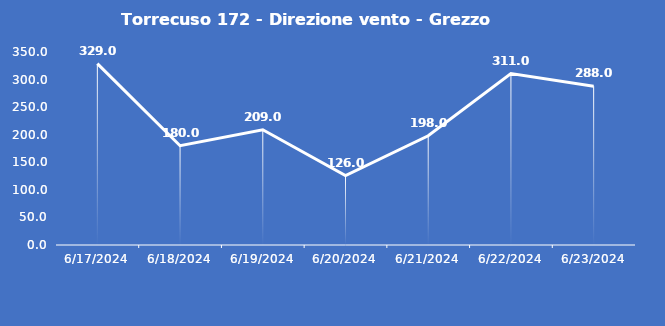
| Category | Torrecuso 172 - Direzione vento - Grezzo (°N) |
|---|---|
| 6/17/24 | 329 |
| 6/18/24 | 180 |
| 6/19/24 | 209 |
| 6/20/24 | 126 |
| 6/21/24 | 198 |
| 6/22/24 | 311 |
| 6/23/24 | 288 |